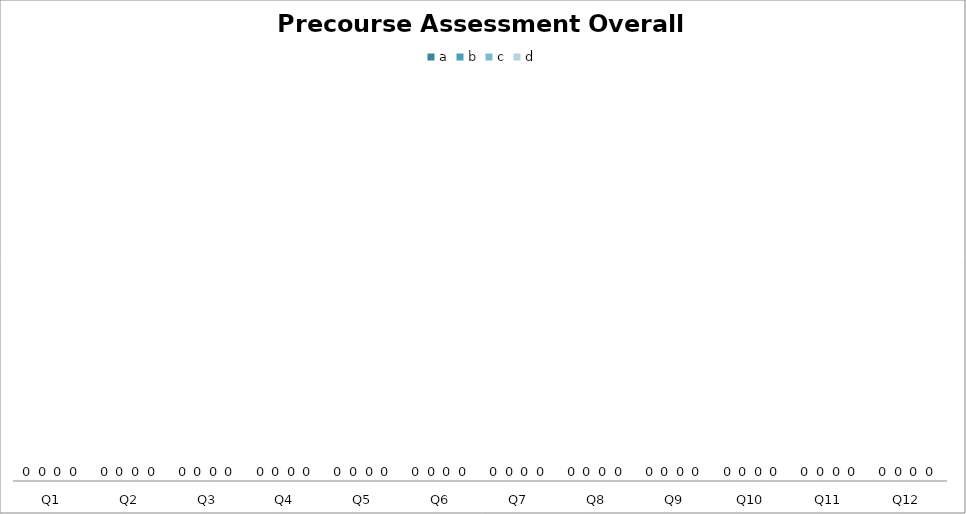
| Category | a | b | c | d |
|---|---|---|---|---|
| Q1 | 0 | 0 | 0 | 0 |
| Q2 | 0 | 0 | 0 | 0 |
| Q3 | 0 | 0 | 0 | 0 |
| Q4 | 0 | 0 | 0 | 0 |
| Q5 | 0 | 0 | 0 | 0 |
| Q6 | 0 | 0 | 0 | 0 |
| Q7 | 0 | 0 | 0 | 0 |
| Q8 | 0 | 0 | 0 | 0 |
| Q9 | 0 | 0 | 0 | 0 |
| Q10 | 0 | 0 | 0 | 0 |
| Q11 | 0 | 0 | 0 | 0 |
| Q12 | 0 | 0 | 0 | 0 |